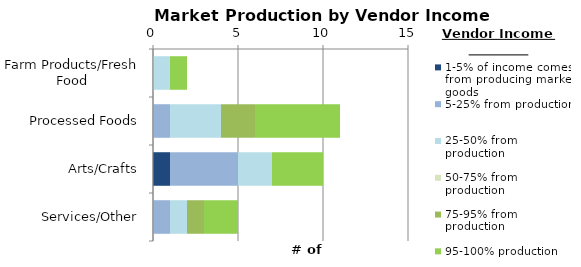
| Category | 1-5% of income comes from producing market goods | 5-25% from production | 25-50% from production | 50-75% from production | 75-95% from production | 95-100% production |
|---|---|---|---|---|---|---|
| Farm Products/Fresh Food | 0 | 0 | 1 | 0 | 0 | 1 |
| Processed Foods | 0 | 1 | 3 | 0 | 2 | 5 |
| Arts/Crafts | 1 | 4 | 2 | 0 | 0 | 3 |
| Services/Other | 0 | 1 | 1 | 0 | 1 | 2 |